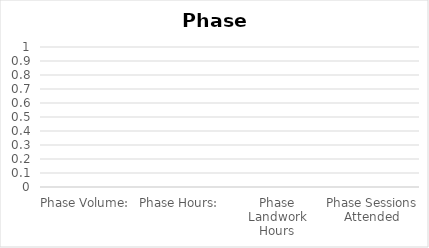
| Category | Total |
|---|---|
| Phase Volume:  | 0 |
| Phase Hours:  | 0 |
| Phase Landwork Hours | 0 |
| Phase Sessions Attended | 0 |